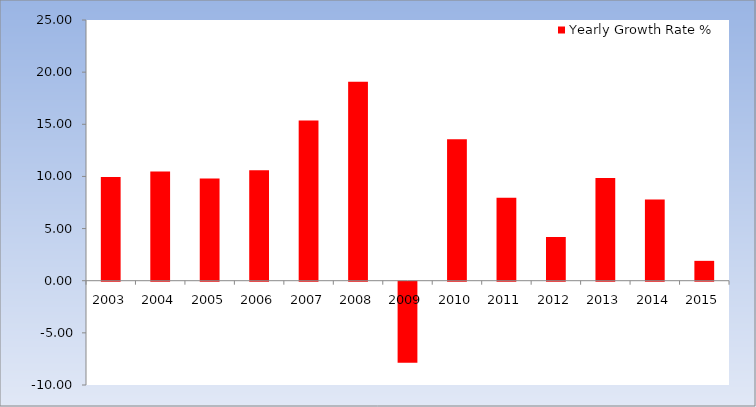
| Category | Yearly Growth Rate % |
|---|---|
| 2003.0 | 9.955 |
| 2004.0 | 10.478 |
| 2005.0 | 9.799 |
| 2006.0 | 10.588 |
| 2007.0 | 15.374 |
| 2008.0 | 19.069 |
| 2009.0 | -7.775 |
| 2010.0 | 13.563 |
| 2011.0 | 7.949 |
| 2012.0 | 4.2 |
| 2013.0 | 9.844 |
| 2014.0 | 7.793 |
| 2015.0 | 1.905 |